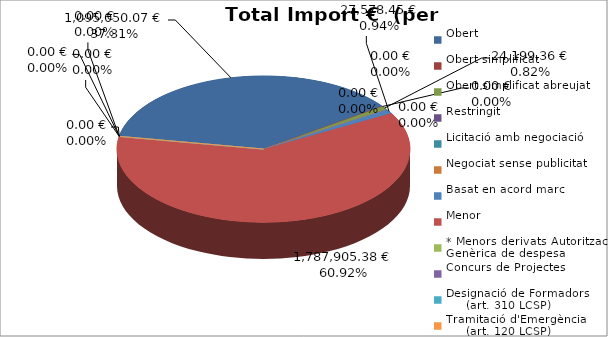
| Category | Total preu
(amb IVA) |
|---|---|
| Obert | 1095050.07 |
| Obert simplificat | 0 |
| Obert simplificat abreujat | 24199.36 |
| Restringit | 0 |
| Licitació amb negociació | 0 |
| Negociat sense publicitat | 0 |
| Basat en acord marc | 27578.45 |
| Menor | 1787905.38 |
| * Menors derivats Autorització Genèrica de despesa | 0 |
| Concurs de Projectes | 0 |
| Designació de Formadors
     (art. 310 LCSP) | 0 |
| Tramitació d'Emergència
     (art. 120 LCSP) | 0 |